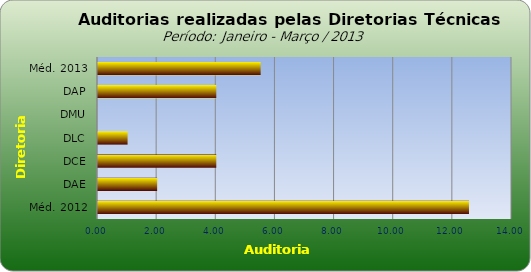
| Category | Series 0 |
|---|---|
| Méd. 2012 | 12.545 |
| DAE | 2 |
| DCE | 4 |
| DLC | 1 |
| DMU | 0 |
| DAP | 4 |
| Méd. 2013 | 5.5 |